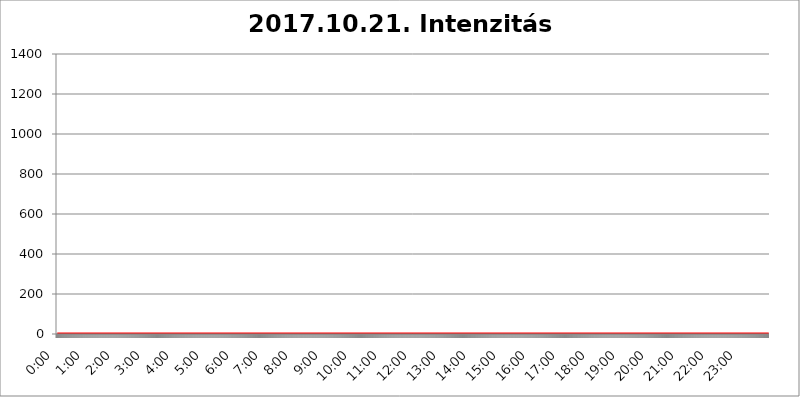
| Category | 2017.10.21. Intenzitás [W/m^2] |
|---|---|
| 0.0 | 0 |
| 0.0006944444444444445 | 0 |
| 0.001388888888888889 | 0 |
| 0.0020833333333333333 | 0 |
| 0.002777777777777778 | 0 |
| 0.003472222222222222 | 0 |
| 0.004166666666666667 | 0 |
| 0.004861111111111111 | 0 |
| 0.005555555555555556 | 0 |
| 0.0062499999999999995 | 0 |
| 0.006944444444444444 | 0 |
| 0.007638888888888889 | 0 |
| 0.008333333333333333 | 0 |
| 0.009027777777777779 | 0 |
| 0.009722222222222222 | 0 |
| 0.010416666666666666 | 0 |
| 0.011111111111111112 | 0 |
| 0.011805555555555555 | 0 |
| 0.012499999999999999 | 0 |
| 0.013194444444444444 | 0 |
| 0.013888888888888888 | 0 |
| 0.014583333333333332 | 0 |
| 0.015277777777777777 | 0 |
| 0.015972222222222224 | 0 |
| 0.016666666666666666 | 0 |
| 0.017361111111111112 | 0 |
| 0.018055555555555557 | 0 |
| 0.01875 | 0 |
| 0.019444444444444445 | 0 |
| 0.02013888888888889 | 0 |
| 0.020833333333333332 | 0 |
| 0.02152777777777778 | 0 |
| 0.022222222222222223 | 0 |
| 0.02291666666666667 | 0 |
| 0.02361111111111111 | 0 |
| 0.024305555555555556 | 0 |
| 0.024999999999999998 | 0 |
| 0.025694444444444447 | 0 |
| 0.02638888888888889 | 0 |
| 0.027083333333333334 | 0 |
| 0.027777777777777776 | 0 |
| 0.02847222222222222 | 0 |
| 0.029166666666666664 | 0 |
| 0.029861111111111113 | 0 |
| 0.030555555555555555 | 0 |
| 0.03125 | 0 |
| 0.03194444444444445 | 0 |
| 0.03263888888888889 | 0 |
| 0.03333333333333333 | 0 |
| 0.034027777777777775 | 0 |
| 0.034722222222222224 | 0 |
| 0.035416666666666666 | 0 |
| 0.036111111111111115 | 0 |
| 0.03680555555555556 | 0 |
| 0.0375 | 0 |
| 0.03819444444444444 | 0 |
| 0.03888888888888889 | 0 |
| 0.03958333333333333 | 0 |
| 0.04027777777777778 | 0 |
| 0.04097222222222222 | 0 |
| 0.041666666666666664 | 0 |
| 0.042361111111111106 | 0 |
| 0.04305555555555556 | 0 |
| 0.043750000000000004 | 0 |
| 0.044444444444444446 | 0 |
| 0.04513888888888889 | 0 |
| 0.04583333333333334 | 0 |
| 0.04652777777777778 | 0 |
| 0.04722222222222222 | 0 |
| 0.04791666666666666 | 0 |
| 0.04861111111111111 | 0 |
| 0.049305555555555554 | 0 |
| 0.049999999999999996 | 0 |
| 0.05069444444444445 | 0 |
| 0.051388888888888894 | 0 |
| 0.052083333333333336 | 0 |
| 0.05277777777777778 | 0 |
| 0.05347222222222222 | 0 |
| 0.05416666666666667 | 0 |
| 0.05486111111111111 | 0 |
| 0.05555555555555555 | 0 |
| 0.05625 | 0 |
| 0.05694444444444444 | 0 |
| 0.057638888888888885 | 0 |
| 0.05833333333333333 | 0 |
| 0.05902777777777778 | 0 |
| 0.059722222222222225 | 0 |
| 0.06041666666666667 | 0 |
| 0.061111111111111116 | 0 |
| 0.06180555555555556 | 0 |
| 0.0625 | 0 |
| 0.06319444444444444 | 0 |
| 0.06388888888888888 | 0 |
| 0.06458333333333334 | 0 |
| 0.06527777777777778 | 0 |
| 0.06597222222222222 | 0 |
| 0.06666666666666667 | 0 |
| 0.06736111111111111 | 0 |
| 0.06805555555555555 | 0 |
| 0.06874999999999999 | 0 |
| 0.06944444444444443 | 0 |
| 0.07013888888888889 | 0 |
| 0.07083333333333333 | 0 |
| 0.07152777777777779 | 0 |
| 0.07222222222222223 | 0 |
| 0.07291666666666667 | 0 |
| 0.07361111111111111 | 0 |
| 0.07430555555555556 | 0 |
| 0.075 | 0 |
| 0.07569444444444444 | 0 |
| 0.0763888888888889 | 0 |
| 0.07708333333333334 | 0 |
| 0.07777777777777778 | 0 |
| 0.07847222222222222 | 0 |
| 0.07916666666666666 | 0 |
| 0.0798611111111111 | 0 |
| 0.08055555555555556 | 0 |
| 0.08125 | 0 |
| 0.08194444444444444 | 0 |
| 0.08263888888888889 | 0 |
| 0.08333333333333333 | 0 |
| 0.08402777777777777 | 0 |
| 0.08472222222222221 | 0 |
| 0.08541666666666665 | 0 |
| 0.08611111111111112 | 0 |
| 0.08680555555555557 | 0 |
| 0.08750000000000001 | 0 |
| 0.08819444444444445 | 0 |
| 0.08888888888888889 | 0 |
| 0.08958333333333333 | 0 |
| 0.09027777777777778 | 0 |
| 0.09097222222222222 | 0 |
| 0.09166666666666667 | 0 |
| 0.09236111111111112 | 0 |
| 0.09305555555555556 | 0 |
| 0.09375 | 0 |
| 0.09444444444444444 | 0 |
| 0.09513888888888888 | 0 |
| 0.09583333333333333 | 0 |
| 0.09652777777777777 | 0 |
| 0.09722222222222222 | 0 |
| 0.09791666666666667 | 0 |
| 0.09861111111111111 | 0 |
| 0.09930555555555555 | 0 |
| 0.09999999999999999 | 0 |
| 0.10069444444444443 | 0 |
| 0.1013888888888889 | 0 |
| 0.10208333333333335 | 0 |
| 0.10277777777777779 | 0 |
| 0.10347222222222223 | 0 |
| 0.10416666666666667 | 0 |
| 0.10486111111111111 | 0 |
| 0.10555555555555556 | 0 |
| 0.10625 | 0 |
| 0.10694444444444444 | 0 |
| 0.1076388888888889 | 0 |
| 0.10833333333333334 | 0 |
| 0.10902777777777778 | 0 |
| 0.10972222222222222 | 0 |
| 0.1111111111111111 | 0 |
| 0.11180555555555556 | 0 |
| 0.11180555555555556 | 0 |
| 0.1125 | 0 |
| 0.11319444444444444 | 0 |
| 0.11388888888888889 | 0 |
| 0.11458333333333333 | 0 |
| 0.11527777777777777 | 0 |
| 0.11597222222222221 | 0 |
| 0.11666666666666665 | 0 |
| 0.1173611111111111 | 0 |
| 0.11805555555555557 | 0 |
| 0.11944444444444445 | 0 |
| 0.12013888888888889 | 0 |
| 0.12083333333333333 | 0 |
| 0.12152777777777778 | 0 |
| 0.12222222222222223 | 0 |
| 0.12291666666666667 | 0 |
| 0.12291666666666667 | 0 |
| 0.12361111111111112 | 0 |
| 0.12430555555555556 | 0 |
| 0.125 | 0 |
| 0.12569444444444444 | 0 |
| 0.12638888888888888 | 0 |
| 0.12708333333333333 | 0 |
| 0.16875 | 0 |
| 0.12847222222222224 | 0 |
| 0.12916666666666668 | 0 |
| 0.12986111111111112 | 0 |
| 0.13055555555555556 | 0 |
| 0.13125 | 0 |
| 0.13194444444444445 | 0 |
| 0.1326388888888889 | 0 |
| 0.13333333333333333 | 0 |
| 0.13402777777777777 | 0 |
| 0.13402777777777777 | 0 |
| 0.13472222222222222 | 0 |
| 0.13541666666666666 | 0 |
| 0.1361111111111111 | 0 |
| 0.13749999999999998 | 0 |
| 0.13819444444444443 | 0 |
| 0.1388888888888889 | 0 |
| 0.13958333333333334 | 0 |
| 0.14027777777777778 | 0 |
| 0.14097222222222222 | 0 |
| 0.14166666666666666 | 0 |
| 0.1423611111111111 | 0 |
| 0.14305555555555557 | 0 |
| 0.14375000000000002 | 0 |
| 0.14444444444444446 | 0 |
| 0.1451388888888889 | 0 |
| 0.1451388888888889 | 0 |
| 0.14652777777777778 | 0 |
| 0.14722222222222223 | 0 |
| 0.14791666666666667 | 0 |
| 0.1486111111111111 | 0 |
| 0.14930555555555555 | 0 |
| 0.15 | 0 |
| 0.15069444444444444 | 0 |
| 0.15138888888888888 | 0 |
| 0.15208333333333332 | 0 |
| 0.15277777777777776 | 0 |
| 0.15347222222222223 | 0 |
| 0.15416666666666667 | 0 |
| 0.15486111111111112 | 0 |
| 0.15555555555555556 | 0 |
| 0.15625 | 0 |
| 0.15694444444444444 | 0 |
| 0.15763888888888888 | 0 |
| 0.15833333333333333 | 0 |
| 0.15902777777777777 | 0 |
| 0.15972222222222224 | 0 |
| 0.16041666666666668 | 0 |
| 0.16111111111111112 | 0 |
| 0.16180555555555556 | 0 |
| 0.1625 | 0 |
| 0.16319444444444445 | 0 |
| 0.1638888888888889 | 0 |
| 0.16458333333333333 | 0 |
| 0.16527777777777777 | 0 |
| 0.16597222222222222 | 0 |
| 0.16666666666666666 | 0 |
| 0.1673611111111111 | 0 |
| 0.16805555555555554 | 0 |
| 0.16874999999999998 | 0 |
| 0.16944444444444443 | 0 |
| 0.17013888888888887 | 0 |
| 0.1708333333333333 | 0 |
| 0.17152777777777775 | 0 |
| 0.17222222222222225 | 0 |
| 0.1729166666666667 | 0 |
| 0.17361111111111113 | 0 |
| 0.17430555555555557 | 0 |
| 0.17500000000000002 | 0 |
| 0.17569444444444446 | 0 |
| 0.1763888888888889 | 0 |
| 0.17708333333333334 | 0 |
| 0.17777777777777778 | 0 |
| 0.17847222222222223 | 0 |
| 0.17916666666666667 | 0 |
| 0.1798611111111111 | 0 |
| 0.18055555555555555 | 0 |
| 0.18125 | 0 |
| 0.18194444444444444 | 0 |
| 0.1826388888888889 | 0 |
| 0.18333333333333335 | 0 |
| 0.1840277777777778 | 0 |
| 0.18472222222222223 | 0 |
| 0.18541666666666667 | 0 |
| 0.18611111111111112 | 0 |
| 0.18680555555555556 | 0 |
| 0.1875 | 0 |
| 0.18819444444444444 | 0 |
| 0.18888888888888888 | 0 |
| 0.18958333333333333 | 0 |
| 0.19027777777777777 | 0 |
| 0.1909722222222222 | 0 |
| 0.19166666666666665 | 0 |
| 0.19236111111111112 | 0 |
| 0.19305555555555554 | 0 |
| 0.19375 | 0 |
| 0.19444444444444445 | 0 |
| 0.1951388888888889 | 0 |
| 0.19583333333333333 | 0 |
| 0.19652777777777777 | 0 |
| 0.19722222222222222 | 0 |
| 0.19791666666666666 | 0 |
| 0.1986111111111111 | 0 |
| 0.19930555555555554 | 0 |
| 0.19999999999999998 | 0 |
| 0.20069444444444443 | 0 |
| 0.20138888888888887 | 0 |
| 0.2020833333333333 | 0 |
| 0.2027777777777778 | 0 |
| 0.2034722222222222 | 0 |
| 0.2041666666666667 | 0 |
| 0.20486111111111113 | 0 |
| 0.20555555555555557 | 0 |
| 0.20625000000000002 | 0 |
| 0.20694444444444446 | 0 |
| 0.2076388888888889 | 0 |
| 0.20833333333333334 | 0 |
| 0.20902777777777778 | 0 |
| 0.20972222222222223 | 0 |
| 0.21041666666666667 | 0 |
| 0.2111111111111111 | 0 |
| 0.21180555555555555 | 0 |
| 0.2125 | 0 |
| 0.21319444444444444 | 0 |
| 0.2138888888888889 | 0 |
| 0.21458333333333335 | 0 |
| 0.2152777777777778 | 0 |
| 0.21597222222222223 | 0 |
| 0.21666666666666667 | 0 |
| 0.21736111111111112 | 0 |
| 0.21805555555555556 | 0 |
| 0.21875 | 0 |
| 0.21944444444444444 | 0 |
| 0.22013888888888888 | 0 |
| 0.22083333333333333 | 0 |
| 0.22152777777777777 | 0 |
| 0.2222222222222222 | 0 |
| 0.22291666666666665 | 0 |
| 0.2236111111111111 | 0 |
| 0.22430555555555556 | 0 |
| 0.225 | 0 |
| 0.22569444444444445 | 0 |
| 0.2263888888888889 | 0 |
| 0.22708333333333333 | 0 |
| 0.22777777777777777 | 0 |
| 0.22847222222222222 | 0 |
| 0.22916666666666666 | 0 |
| 0.2298611111111111 | 0 |
| 0.23055555555555554 | 0 |
| 0.23124999999999998 | 0 |
| 0.23194444444444443 | 0 |
| 0.23263888888888887 | 0 |
| 0.2333333333333333 | 0 |
| 0.2340277777777778 | 0 |
| 0.2347222222222222 | 0 |
| 0.2354166666666667 | 0 |
| 0.23611111111111113 | 0 |
| 0.23680555555555557 | 0 |
| 0.23750000000000002 | 0 |
| 0.23819444444444446 | 0 |
| 0.2388888888888889 | 0 |
| 0.23958333333333334 | 0 |
| 0.24027777777777778 | 0 |
| 0.24097222222222223 | 0 |
| 0.24166666666666667 | 0 |
| 0.2423611111111111 | 0 |
| 0.24305555555555555 | 0 |
| 0.24375 | 0 |
| 0.24444444444444446 | 0 |
| 0.24513888888888888 | 0 |
| 0.24583333333333335 | 0 |
| 0.2465277777777778 | 0 |
| 0.24722222222222223 | 0 |
| 0.24791666666666667 | 0 |
| 0.24861111111111112 | 0 |
| 0.24930555555555556 | 0 |
| 0.25 | 0 |
| 0.25069444444444444 | 0 |
| 0.2513888888888889 | 0 |
| 0.2520833333333333 | 0 |
| 0.25277777777777777 | 0 |
| 0.2534722222222222 | 0 |
| 0.25416666666666665 | 0 |
| 0.2548611111111111 | 0 |
| 0.2555555555555556 | 0 |
| 0.25625000000000003 | 0 |
| 0.2569444444444445 | 0 |
| 0.2576388888888889 | 0 |
| 0.25833333333333336 | 0 |
| 0.2590277777777778 | 0 |
| 0.25972222222222224 | 0 |
| 0.2604166666666667 | 0 |
| 0.2611111111111111 | 0 |
| 0.26180555555555557 | 0 |
| 0.2625 | 0 |
| 0.26319444444444445 | 0 |
| 0.2638888888888889 | 0 |
| 0.26458333333333334 | 0 |
| 0.2652777777777778 | 0 |
| 0.2659722222222222 | 0 |
| 0.26666666666666666 | 0 |
| 0.2673611111111111 | 0 |
| 0.26805555555555555 | 0 |
| 0.26875 | 0 |
| 0.26944444444444443 | 0 |
| 0.2701388888888889 | 0 |
| 0.2708333333333333 | 0 |
| 0.27152777777777776 | 0 |
| 0.2722222222222222 | 0 |
| 0.27291666666666664 | 0 |
| 0.2736111111111111 | 0 |
| 0.2743055555555555 | 0 |
| 0.27499999999999997 | 0 |
| 0.27569444444444446 | 0 |
| 0.27638888888888885 | 0 |
| 0.27708333333333335 | 0 |
| 0.2777777777777778 | 0 |
| 0.27847222222222223 | 0 |
| 0.2791666666666667 | 0 |
| 0.2798611111111111 | 0 |
| 0.28055555555555556 | 0 |
| 0.28125 | 0 |
| 0.28194444444444444 | 0 |
| 0.2826388888888889 | 0 |
| 0.2833333333333333 | 0 |
| 0.28402777777777777 | 0 |
| 0.2847222222222222 | 0 |
| 0.28541666666666665 | 0 |
| 0.28611111111111115 | 0 |
| 0.28680555555555554 | 0 |
| 0.28750000000000003 | 0 |
| 0.2881944444444445 | 0 |
| 0.2888888888888889 | 0 |
| 0.28958333333333336 | 0 |
| 0.2902777777777778 | 0 |
| 0.29097222222222224 | 0 |
| 0.2916666666666667 | 0 |
| 0.2923611111111111 | 0 |
| 0.29305555555555557 | 0 |
| 0.29375 | 0 |
| 0.29444444444444445 | 0 |
| 0.2951388888888889 | 0 |
| 0.29583333333333334 | 0 |
| 0.2965277777777778 | 0 |
| 0.2972222222222222 | 0 |
| 0.29791666666666666 | 0 |
| 0.2986111111111111 | 0 |
| 0.29930555555555555 | 0 |
| 0.3 | 0 |
| 0.30069444444444443 | 0 |
| 0.3013888888888889 | 0 |
| 0.3020833333333333 | 0 |
| 0.30277777777777776 | 0 |
| 0.3034722222222222 | 0 |
| 0.30416666666666664 | 0 |
| 0.3048611111111111 | 0 |
| 0.3055555555555555 | 0 |
| 0.30624999999999997 | 0 |
| 0.3069444444444444 | 0 |
| 0.3076388888888889 | 0 |
| 0.30833333333333335 | 0 |
| 0.3090277777777778 | 0 |
| 0.30972222222222223 | 0 |
| 0.3104166666666667 | 0 |
| 0.3111111111111111 | 0 |
| 0.31180555555555556 | 0 |
| 0.3125 | 0 |
| 0.31319444444444444 | 0 |
| 0.3138888888888889 | 0 |
| 0.3145833333333333 | 0 |
| 0.31527777777777777 | 0 |
| 0.3159722222222222 | 0 |
| 0.31666666666666665 | 0 |
| 0.31736111111111115 | 0 |
| 0.31805555555555554 | 0 |
| 0.31875000000000003 | 0 |
| 0.3194444444444445 | 0 |
| 0.3201388888888889 | 0 |
| 0.32083333333333336 | 0 |
| 0.3215277777777778 | 0 |
| 0.32222222222222224 | 0 |
| 0.3229166666666667 | 0 |
| 0.3236111111111111 | 0 |
| 0.32430555555555557 | 0 |
| 0.325 | 0 |
| 0.32569444444444445 | 0 |
| 0.3263888888888889 | 0 |
| 0.32708333333333334 | 0 |
| 0.3277777777777778 | 0 |
| 0.3284722222222222 | 0 |
| 0.32916666666666666 | 0 |
| 0.3298611111111111 | 0 |
| 0.33055555555555555 | 0 |
| 0.33125 | 0 |
| 0.33194444444444443 | 0 |
| 0.3326388888888889 | 0 |
| 0.3333333333333333 | 0 |
| 0.3340277777777778 | 0 |
| 0.3347222222222222 | 0 |
| 0.3354166666666667 | 0 |
| 0.3361111111111111 | 0 |
| 0.3368055555555556 | 0 |
| 0.33749999999999997 | 0 |
| 0.33819444444444446 | 0 |
| 0.33888888888888885 | 0 |
| 0.33958333333333335 | 0 |
| 0.34027777777777773 | 0 |
| 0.34097222222222223 | 0 |
| 0.3416666666666666 | 0 |
| 0.3423611111111111 | 0 |
| 0.3430555555555555 | 0 |
| 0.34375 | 0 |
| 0.3444444444444445 | 0 |
| 0.3451388888888889 | 0 |
| 0.3458333333333334 | 0 |
| 0.34652777777777777 | 0 |
| 0.34722222222222227 | 0 |
| 0.34791666666666665 | 0 |
| 0.34861111111111115 | 0 |
| 0.34930555555555554 | 0 |
| 0.35000000000000003 | 0 |
| 0.3506944444444444 | 0 |
| 0.3513888888888889 | 0 |
| 0.3520833333333333 | 0 |
| 0.3527777777777778 | 0 |
| 0.3534722222222222 | 0 |
| 0.3541666666666667 | 0 |
| 0.3548611111111111 | 0 |
| 0.35555555555555557 | 0 |
| 0.35625 | 0 |
| 0.35694444444444445 | 0 |
| 0.3576388888888889 | 0 |
| 0.35833333333333334 | 0 |
| 0.3590277777777778 | 0 |
| 0.3597222222222222 | 0 |
| 0.36041666666666666 | 0 |
| 0.3611111111111111 | 0 |
| 0.36180555555555555 | 0 |
| 0.3625 | 0 |
| 0.36319444444444443 | 0 |
| 0.3638888888888889 | 0 |
| 0.3645833333333333 | 0 |
| 0.3652777777777778 | 0 |
| 0.3659722222222222 | 0 |
| 0.3666666666666667 | 0 |
| 0.3673611111111111 | 0 |
| 0.3680555555555556 | 0 |
| 0.36874999999999997 | 0 |
| 0.36944444444444446 | 0 |
| 0.37013888888888885 | 0 |
| 0.37083333333333335 | 0 |
| 0.37152777777777773 | 0 |
| 0.37222222222222223 | 0 |
| 0.3729166666666666 | 0 |
| 0.3736111111111111 | 0 |
| 0.3743055555555555 | 0 |
| 0.375 | 0 |
| 0.3756944444444445 | 0 |
| 0.3763888888888889 | 0 |
| 0.3770833333333334 | 0 |
| 0.37777777777777777 | 0 |
| 0.37847222222222227 | 0 |
| 0.37916666666666665 | 0 |
| 0.37986111111111115 | 0 |
| 0.38055555555555554 | 0 |
| 0.38125000000000003 | 0 |
| 0.3819444444444444 | 0 |
| 0.3826388888888889 | 0 |
| 0.3833333333333333 | 0 |
| 0.3840277777777778 | 0 |
| 0.3847222222222222 | 0 |
| 0.3854166666666667 | 0 |
| 0.3861111111111111 | 0 |
| 0.38680555555555557 | 0 |
| 0.3875 | 0 |
| 0.38819444444444445 | 0 |
| 0.3888888888888889 | 0 |
| 0.38958333333333334 | 0 |
| 0.3902777777777778 | 0 |
| 0.3909722222222222 | 0 |
| 0.39166666666666666 | 0 |
| 0.3923611111111111 | 0 |
| 0.39305555555555555 | 0 |
| 0.39375 | 0 |
| 0.39444444444444443 | 0 |
| 0.3951388888888889 | 0 |
| 0.3958333333333333 | 0 |
| 0.3965277777777778 | 0 |
| 0.3972222222222222 | 0 |
| 0.3979166666666667 | 0 |
| 0.3986111111111111 | 0 |
| 0.3993055555555556 | 0 |
| 0.39999999999999997 | 0 |
| 0.40069444444444446 | 0 |
| 0.40138888888888885 | 0 |
| 0.40208333333333335 | 0 |
| 0.40277777777777773 | 0 |
| 0.40347222222222223 | 0 |
| 0.4041666666666666 | 0 |
| 0.4048611111111111 | 0 |
| 0.4055555555555555 | 0 |
| 0.40625 | 0 |
| 0.4069444444444445 | 0 |
| 0.4076388888888889 | 0 |
| 0.4083333333333334 | 0 |
| 0.40902777777777777 | 0 |
| 0.40972222222222227 | 0 |
| 0.41041666666666665 | 0 |
| 0.41111111111111115 | 0 |
| 0.41180555555555554 | 0 |
| 0.41250000000000003 | 0 |
| 0.4131944444444444 | 0 |
| 0.4138888888888889 | 0 |
| 0.4145833333333333 | 0 |
| 0.4152777777777778 | 0 |
| 0.4159722222222222 | 0 |
| 0.4166666666666667 | 0 |
| 0.4173611111111111 | 0 |
| 0.41805555555555557 | 0 |
| 0.41875 | 0 |
| 0.41944444444444445 | 0 |
| 0.4201388888888889 | 0 |
| 0.42083333333333334 | 0 |
| 0.4215277777777778 | 0 |
| 0.4222222222222222 | 0 |
| 0.42291666666666666 | 0 |
| 0.4236111111111111 | 0 |
| 0.42430555555555555 | 0 |
| 0.425 | 0 |
| 0.42569444444444443 | 0 |
| 0.4263888888888889 | 0 |
| 0.4270833333333333 | 0 |
| 0.4277777777777778 | 0 |
| 0.4284722222222222 | 0 |
| 0.4291666666666667 | 0 |
| 0.4298611111111111 | 0 |
| 0.4305555555555556 | 0 |
| 0.43124999999999997 | 0 |
| 0.43194444444444446 | 0 |
| 0.43263888888888885 | 0 |
| 0.43333333333333335 | 0 |
| 0.43402777777777773 | 0 |
| 0.43472222222222223 | 0 |
| 0.4354166666666666 | 0 |
| 0.4361111111111111 | 0 |
| 0.4368055555555555 | 0 |
| 0.4375 | 0 |
| 0.4381944444444445 | 0 |
| 0.4388888888888889 | 0 |
| 0.4395833333333334 | 0 |
| 0.44027777777777777 | 0 |
| 0.44097222222222227 | 0 |
| 0.44166666666666665 | 0 |
| 0.44236111111111115 | 0 |
| 0.44305555555555554 | 0 |
| 0.44375000000000003 | 0 |
| 0.4444444444444444 | 0 |
| 0.4451388888888889 | 0 |
| 0.4458333333333333 | 0 |
| 0.4465277777777778 | 0 |
| 0.4472222222222222 | 0 |
| 0.4479166666666667 | 0 |
| 0.4486111111111111 | 0 |
| 0.44930555555555557 | 0 |
| 0.45 | 0 |
| 0.45069444444444445 | 0 |
| 0.4513888888888889 | 0 |
| 0.45208333333333334 | 0 |
| 0.4527777777777778 | 0 |
| 0.4534722222222222 | 0 |
| 0.45416666666666666 | 0 |
| 0.4548611111111111 | 0 |
| 0.45555555555555555 | 0 |
| 0.45625 | 0 |
| 0.45694444444444443 | 0 |
| 0.4576388888888889 | 0 |
| 0.4583333333333333 | 0 |
| 0.4590277777777778 | 0 |
| 0.4597222222222222 | 0 |
| 0.4604166666666667 | 0 |
| 0.4611111111111111 | 0 |
| 0.4618055555555556 | 0 |
| 0.46249999999999997 | 0 |
| 0.46319444444444446 | 0 |
| 0.46388888888888885 | 0 |
| 0.46458333333333335 | 0 |
| 0.46527777777777773 | 0 |
| 0.46597222222222223 | 0 |
| 0.4666666666666666 | 0 |
| 0.4673611111111111 | 0 |
| 0.4680555555555555 | 0 |
| 0.46875 | 0 |
| 0.4694444444444445 | 0 |
| 0.4701388888888889 | 0 |
| 0.4708333333333334 | 0 |
| 0.47152777777777777 | 0 |
| 0.47222222222222227 | 0 |
| 0.47291666666666665 | 0 |
| 0.47361111111111115 | 0 |
| 0.47430555555555554 | 0 |
| 0.47500000000000003 | 0 |
| 0.4756944444444444 | 0 |
| 0.4763888888888889 | 0 |
| 0.4770833333333333 | 0 |
| 0.4777777777777778 | 0 |
| 0.4784722222222222 | 0 |
| 0.4791666666666667 | 0 |
| 0.4798611111111111 | 0 |
| 0.48055555555555557 | 0 |
| 0.48125 | 0 |
| 0.48194444444444445 | 0 |
| 0.4826388888888889 | 0 |
| 0.48333333333333334 | 0 |
| 0.4840277777777778 | 0 |
| 0.4847222222222222 | 0 |
| 0.48541666666666666 | 0 |
| 0.4861111111111111 | 0 |
| 0.48680555555555555 | 0 |
| 0.4875 | 0 |
| 0.48819444444444443 | 0 |
| 0.4888888888888889 | 0 |
| 0.4895833333333333 | 0 |
| 0.4902777777777778 | 0 |
| 0.4909722222222222 | 0 |
| 0.4916666666666667 | 0 |
| 0.4923611111111111 | 0 |
| 0.4930555555555556 | 0 |
| 0.49374999999999997 | 0 |
| 0.49444444444444446 | 0 |
| 0.49513888888888885 | 0 |
| 0.49583333333333335 | 0 |
| 0.49652777777777773 | 0 |
| 0.49722222222222223 | 0 |
| 0.4979166666666666 | 0 |
| 0.4986111111111111 | 0 |
| 0.4993055555555555 | 0 |
| 0.5 | 0 |
| 0.5006944444444444 | 0 |
| 0.5013888888888889 | 0 |
| 0.5020833333333333 | 0 |
| 0.5027777777777778 | 0 |
| 0.5034722222222222 | 0 |
| 0.5041666666666667 | 0 |
| 0.5048611111111111 | 0 |
| 0.5055555555555555 | 0 |
| 0.50625 | 0 |
| 0.5069444444444444 | 0 |
| 0.5076388888888889 | 0 |
| 0.5083333333333333 | 0 |
| 0.5090277777777777 | 0 |
| 0.5097222222222222 | 0 |
| 0.5104166666666666 | 0 |
| 0.5111111111111112 | 0 |
| 0.5118055555555555 | 0 |
| 0.5125000000000001 | 0 |
| 0.5131944444444444 | 0 |
| 0.513888888888889 | 0 |
| 0.5145833333333333 | 0 |
| 0.5152777777777778 | 0 |
| 0.5159722222222222 | 0 |
| 0.5166666666666667 | 0 |
| 0.517361111111111 | 0 |
| 0.5180555555555556 | 0 |
| 0.5187499999999999 | 0 |
| 0.5194444444444445 | 0 |
| 0.5201388888888888 | 0 |
| 0.5208333333333334 | 0 |
| 0.5215277777777778 | 0 |
| 0.5222222222222223 | 0 |
| 0.5229166666666667 | 0 |
| 0.5236111111111111 | 0 |
| 0.5243055555555556 | 0 |
| 0.525 | 0 |
| 0.5256944444444445 | 0 |
| 0.5263888888888889 | 0 |
| 0.5270833333333333 | 0 |
| 0.5277777777777778 | 0 |
| 0.5284722222222222 | 0 |
| 0.5291666666666667 | 0 |
| 0.5298611111111111 | 0 |
| 0.5305555555555556 | 0 |
| 0.53125 | 0 |
| 0.5319444444444444 | 0 |
| 0.5326388888888889 | 0 |
| 0.5333333333333333 | 0 |
| 0.5340277777777778 | 0 |
| 0.5347222222222222 | 0 |
| 0.5354166666666667 | 0 |
| 0.5361111111111111 | 0 |
| 0.5368055555555555 | 0 |
| 0.5375 | 0 |
| 0.5381944444444444 | 0 |
| 0.5388888888888889 | 0 |
| 0.5395833333333333 | 0 |
| 0.5402777777777777 | 0 |
| 0.5409722222222222 | 0 |
| 0.5416666666666666 | 0 |
| 0.5423611111111112 | 0 |
| 0.5430555555555555 | 0 |
| 0.5437500000000001 | 0 |
| 0.5444444444444444 | 0 |
| 0.545138888888889 | 0 |
| 0.5458333333333333 | 0 |
| 0.5465277777777778 | 0 |
| 0.5472222222222222 | 0 |
| 0.5479166666666667 | 0 |
| 0.548611111111111 | 0 |
| 0.5493055555555556 | 0 |
| 0.5499999999999999 | 0 |
| 0.5506944444444445 | 0 |
| 0.5513888888888888 | 0 |
| 0.5520833333333334 | 0 |
| 0.5527777777777778 | 0 |
| 0.5534722222222223 | 0 |
| 0.5541666666666667 | 0 |
| 0.5548611111111111 | 0 |
| 0.5555555555555556 | 0 |
| 0.55625 | 0 |
| 0.5569444444444445 | 0 |
| 0.5576388888888889 | 0 |
| 0.5583333333333333 | 0 |
| 0.5590277777777778 | 0 |
| 0.5597222222222222 | 0 |
| 0.5604166666666667 | 0 |
| 0.5611111111111111 | 0 |
| 0.5618055555555556 | 0 |
| 0.5625 | 0 |
| 0.5631944444444444 | 0 |
| 0.5638888888888889 | 0 |
| 0.5645833333333333 | 0 |
| 0.5652777777777778 | 0 |
| 0.5659722222222222 | 0 |
| 0.5666666666666667 | 0 |
| 0.5673611111111111 | 0 |
| 0.5680555555555555 | 0 |
| 0.56875 | 0 |
| 0.5694444444444444 | 0 |
| 0.5701388888888889 | 0 |
| 0.5708333333333333 | 0 |
| 0.5715277777777777 | 0 |
| 0.5722222222222222 | 0 |
| 0.5729166666666666 | 0 |
| 0.5736111111111112 | 0 |
| 0.5743055555555555 | 0 |
| 0.5750000000000001 | 0 |
| 0.5756944444444444 | 0 |
| 0.576388888888889 | 0 |
| 0.5770833333333333 | 0 |
| 0.5777777777777778 | 0 |
| 0.5784722222222222 | 0 |
| 0.5791666666666667 | 0 |
| 0.579861111111111 | 0 |
| 0.5805555555555556 | 0 |
| 0.5812499999999999 | 0 |
| 0.5819444444444445 | 0 |
| 0.5826388888888888 | 0 |
| 0.5833333333333334 | 0 |
| 0.5840277777777778 | 0 |
| 0.5847222222222223 | 0 |
| 0.5854166666666667 | 0 |
| 0.5861111111111111 | 0 |
| 0.5868055555555556 | 0 |
| 0.5875 | 0 |
| 0.5881944444444445 | 0 |
| 0.5888888888888889 | 0 |
| 0.5895833333333333 | 0 |
| 0.5902777777777778 | 0 |
| 0.5909722222222222 | 0 |
| 0.5916666666666667 | 0 |
| 0.5923611111111111 | 0 |
| 0.5930555555555556 | 0 |
| 0.59375 | 0 |
| 0.5944444444444444 | 0 |
| 0.5951388888888889 | 0 |
| 0.5958333333333333 | 0 |
| 0.5965277777777778 | 0 |
| 0.5972222222222222 | 0 |
| 0.5979166666666667 | 0 |
| 0.5986111111111111 | 0 |
| 0.5993055555555555 | 0 |
| 0.6 | 0 |
| 0.6006944444444444 | 0 |
| 0.6013888888888889 | 0 |
| 0.6020833333333333 | 0 |
| 0.6027777777777777 | 0 |
| 0.6034722222222222 | 0 |
| 0.6041666666666666 | 0 |
| 0.6048611111111112 | 0 |
| 0.6055555555555555 | 0 |
| 0.6062500000000001 | 0 |
| 0.6069444444444444 | 0 |
| 0.607638888888889 | 0 |
| 0.6083333333333333 | 0 |
| 0.6090277777777778 | 0 |
| 0.6097222222222222 | 0 |
| 0.6104166666666667 | 0 |
| 0.611111111111111 | 0 |
| 0.6118055555555556 | 0 |
| 0.6124999999999999 | 0 |
| 0.6131944444444445 | 0 |
| 0.6138888888888888 | 0 |
| 0.6145833333333334 | 0 |
| 0.6152777777777778 | 0 |
| 0.6159722222222223 | 0 |
| 0.6166666666666667 | 0 |
| 0.6173611111111111 | 0 |
| 0.6180555555555556 | 0 |
| 0.61875 | 0 |
| 0.6194444444444445 | 0 |
| 0.6201388888888889 | 0 |
| 0.6208333333333333 | 0 |
| 0.6215277777777778 | 0 |
| 0.6222222222222222 | 0 |
| 0.6229166666666667 | 0 |
| 0.6236111111111111 | 0 |
| 0.6243055555555556 | 0 |
| 0.625 | 0 |
| 0.6256944444444444 | 0 |
| 0.6263888888888889 | 0 |
| 0.6270833333333333 | 0 |
| 0.6277777777777778 | 0 |
| 0.6284722222222222 | 0 |
| 0.6291666666666667 | 0 |
| 0.6298611111111111 | 0 |
| 0.6305555555555555 | 0 |
| 0.63125 | 0 |
| 0.6319444444444444 | 0 |
| 0.6326388888888889 | 0 |
| 0.6333333333333333 | 0 |
| 0.6340277777777777 | 0 |
| 0.6347222222222222 | 0 |
| 0.6354166666666666 | 0 |
| 0.6361111111111112 | 0 |
| 0.6368055555555555 | 0 |
| 0.6375000000000001 | 0 |
| 0.6381944444444444 | 0 |
| 0.638888888888889 | 0 |
| 0.6395833333333333 | 0 |
| 0.6402777777777778 | 0 |
| 0.6409722222222222 | 0 |
| 0.6416666666666667 | 0 |
| 0.642361111111111 | 0 |
| 0.6430555555555556 | 0 |
| 0.6437499999999999 | 0 |
| 0.6444444444444445 | 0 |
| 0.6451388888888888 | 0 |
| 0.6458333333333334 | 0 |
| 0.6465277777777778 | 0 |
| 0.6472222222222223 | 0 |
| 0.6479166666666667 | 0 |
| 0.6486111111111111 | 0 |
| 0.6493055555555556 | 0 |
| 0.65 | 0 |
| 0.6506944444444445 | 0 |
| 0.6513888888888889 | 0 |
| 0.6520833333333333 | 0 |
| 0.6527777777777778 | 0 |
| 0.6534722222222222 | 0 |
| 0.6541666666666667 | 0 |
| 0.6548611111111111 | 0 |
| 0.6555555555555556 | 0 |
| 0.65625 | 0 |
| 0.6569444444444444 | 0 |
| 0.6576388888888889 | 0 |
| 0.6583333333333333 | 0 |
| 0.6590277777777778 | 0 |
| 0.6597222222222222 | 0 |
| 0.6604166666666667 | 0 |
| 0.6611111111111111 | 0 |
| 0.6618055555555555 | 0 |
| 0.6625 | 0 |
| 0.6631944444444444 | 0 |
| 0.6638888888888889 | 0 |
| 0.6645833333333333 | 0 |
| 0.6652777777777777 | 0 |
| 0.6659722222222222 | 0 |
| 0.6666666666666666 | 0 |
| 0.6673611111111111 | 0 |
| 0.6680555555555556 | 0 |
| 0.6687500000000001 | 0 |
| 0.6694444444444444 | 0 |
| 0.6701388888888888 | 0 |
| 0.6708333333333334 | 0 |
| 0.6715277777777778 | 0 |
| 0.6722222222222222 | 0 |
| 0.6729166666666666 | 0 |
| 0.6736111111111112 | 0 |
| 0.6743055555555556 | 0 |
| 0.6749999999999999 | 0 |
| 0.6756944444444444 | 0 |
| 0.6763888888888889 | 0 |
| 0.6770833333333334 | 0 |
| 0.6777777777777777 | 0 |
| 0.6784722222222223 | 0 |
| 0.6791666666666667 | 0 |
| 0.6798611111111111 | 0 |
| 0.6805555555555555 | 0 |
| 0.68125 | 0 |
| 0.6819444444444445 | 0 |
| 0.6826388888888889 | 0 |
| 0.6833333333333332 | 0 |
| 0.6840277777777778 | 0 |
| 0.6847222222222222 | 0 |
| 0.6854166666666667 | 0 |
| 0.686111111111111 | 0 |
| 0.6868055555555556 | 0 |
| 0.6875 | 0 |
| 0.6881944444444444 | 0 |
| 0.688888888888889 | 0 |
| 0.6895833333333333 | 0 |
| 0.6902777777777778 | 0 |
| 0.6909722222222222 | 0 |
| 0.6916666666666668 | 0 |
| 0.6923611111111111 | 0 |
| 0.6930555555555555 | 0 |
| 0.69375 | 0 |
| 0.6944444444444445 | 0 |
| 0.6951388888888889 | 0 |
| 0.6958333333333333 | 0 |
| 0.6965277777777777 | 0 |
| 0.6972222222222223 | 0 |
| 0.6979166666666666 | 0 |
| 0.6986111111111111 | 0 |
| 0.6993055555555556 | 0 |
| 0.7000000000000001 | 0 |
| 0.7006944444444444 | 0 |
| 0.7013888888888888 | 0 |
| 0.7020833333333334 | 0 |
| 0.7027777777777778 | 0 |
| 0.7034722222222222 | 0 |
| 0.7041666666666666 | 0 |
| 0.7048611111111112 | 0 |
| 0.7055555555555556 | 0 |
| 0.7062499999999999 | 0 |
| 0.7069444444444444 | 0 |
| 0.7076388888888889 | 0 |
| 0.7083333333333334 | 0 |
| 0.7090277777777777 | 0 |
| 0.7097222222222223 | 0 |
| 0.7104166666666667 | 0 |
| 0.7111111111111111 | 0 |
| 0.7118055555555555 | 0 |
| 0.7125 | 0 |
| 0.7131944444444445 | 0 |
| 0.7138888888888889 | 0 |
| 0.7145833333333332 | 0 |
| 0.7152777777777778 | 0 |
| 0.7159722222222222 | 0 |
| 0.7166666666666667 | 0 |
| 0.717361111111111 | 0 |
| 0.7180555555555556 | 0 |
| 0.71875 | 0 |
| 0.7194444444444444 | 0 |
| 0.720138888888889 | 0 |
| 0.7208333333333333 | 0 |
| 0.7215277777777778 | 0 |
| 0.7222222222222222 | 0 |
| 0.7229166666666668 | 0 |
| 0.7236111111111111 | 0 |
| 0.7243055555555555 | 0 |
| 0.725 | 0 |
| 0.7256944444444445 | 0 |
| 0.7263888888888889 | 0 |
| 0.7270833333333333 | 0 |
| 0.7277777777777777 | 0 |
| 0.7284722222222223 | 0 |
| 0.7291666666666666 | 0 |
| 0.7298611111111111 | 0 |
| 0.7305555555555556 | 0 |
| 0.7312500000000001 | 0 |
| 0.7319444444444444 | 0 |
| 0.7326388888888888 | 0 |
| 0.7333333333333334 | 0 |
| 0.7340277777777778 | 0 |
| 0.7347222222222222 | 0 |
| 0.7354166666666666 | 0 |
| 0.7361111111111112 | 0 |
| 0.7368055555555556 | 0 |
| 0.7374999999999999 | 0 |
| 0.7381944444444444 | 0 |
| 0.7388888888888889 | 0 |
| 0.7395833333333334 | 0 |
| 0.7402777777777777 | 0 |
| 0.7409722222222223 | 0 |
| 0.7416666666666667 | 0 |
| 0.7423611111111111 | 0 |
| 0.7430555555555555 | 0 |
| 0.74375 | 0 |
| 0.7444444444444445 | 0 |
| 0.7451388888888889 | 0 |
| 0.7458333333333332 | 0 |
| 0.7465277777777778 | 0 |
| 0.7472222222222222 | 0 |
| 0.7479166666666667 | 0 |
| 0.748611111111111 | 0 |
| 0.7493055555555556 | 0 |
| 0.75 | 0 |
| 0.7506944444444444 | 0 |
| 0.751388888888889 | 0 |
| 0.7520833333333333 | 0 |
| 0.7527777777777778 | 0 |
| 0.7534722222222222 | 0 |
| 0.7541666666666668 | 0 |
| 0.7548611111111111 | 0 |
| 0.7555555555555555 | 0 |
| 0.75625 | 0 |
| 0.7569444444444445 | 0 |
| 0.7576388888888889 | 0 |
| 0.7583333333333333 | 0 |
| 0.7590277777777777 | 0 |
| 0.7597222222222223 | 0 |
| 0.7604166666666666 | 0 |
| 0.7611111111111111 | 0 |
| 0.7618055555555556 | 0 |
| 0.7625000000000001 | 0 |
| 0.7631944444444444 | 0 |
| 0.7638888888888888 | 0 |
| 0.7645833333333334 | 0 |
| 0.7652777777777778 | 0 |
| 0.7659722222222222 | 0 |
| 0.7666666666666666 | 0 |
| 0.7673611111111112 | 0 |
| 0.7680555555555556 | 0 |
| 0.7687499999999999 | 0 |
| 0.7694444444444444 | 0 |
| 0.7701388888888889 | 0 |
| 0.7708333333333334 | 0 |
| 0.7715277777777777 | 0 |
| 0.7722222222222223 | 0 |
| 0.7729166666666667 | 0 |
| 0.7736111111111111 | 0 |
| 0.7743055555555555 | 0 |
| 0.775 | 0 |
| 0.7756944444444445 | 0 |
| 0.7763888888888889 | 0 |
| 0.7770833333333332 | 0 |
| 0.7777777777777778 | 0 |
| 0.7784722222222222 | 0 |
| 0.7791666666666667 | 0 |
| 0.779861111111111 | 0 |
| 0.7805555555555556 | 0 |
| 0.78125 | 0 |
| 0.7819444444444444 | 0 |
| 0.782638888888889 | 0 |
| 0.7833333333333333 | 0 |
| 0.7840277777777778 | 0 |
| 0.7847222222222222 | 0 |
| 0.7854166666666668 | 0 |
| 0.7861111111111111 | 0 |
| 0.7868055555555555 | 0 |
| 0.7875 | 0 |
| 0.7881944444444445 | 0 |
| 0.7888888888888889 | 0 |
| 0.7895833333333333 | 0 |
| 0.7902777777777777 | 0 |
| 0.7909722222222223 | 0 |
| 0.7916666666666666 | 0 |
| 0.7923611111111111 | 0 |
| 0.7930555555555556 | 0 |
| 0.7937500000000001 | 0 |
| 0.7944444444444444 | 0 |
| 0.7951388888888888 | 0 |
| 0.7958333333333334 | 0 |
| 0.7965277777777778 | 0 |
| 0.7972222222222222 | 0 |
| 0.7979166666666666 | 0 |
| 0.7986111111111112 | 0 |
| 0.7993055555555556 | 0 |
| 0.7999999999999999 | 0 |
| 0.8006944444444444 | 0 |
| 0.8013888888888889 | 0 |
| 0.8020833333333334 | 0 |
| 0.8027777777777777 | 0 |
| 0.8034722222222223 | 0 |
| 0.8041666666666667 | 0 |
| 0.8048611111111111 | 0 |
| 0.8055555555555555 | 0 |
| 0.80625 | 0 |
| 0.8069444444444445 | 0 |
| 0.8076388888888889 | 0 |
| 0.8083333333333332 | 0 |
| 0.8090277777777778 | 0 |
| 0.8097222222222222 | 0 |
| 0.8104166666666667 | 0 |
| 0.811111111111111 | 0 |
| 0.8118055555555556 | 0 |
| 0.8125 | 0 |
| 0.8131944444444444 | 0 |
| 0.813888888888889 | 0 |
| 0.8145833333333333 | 0 |
| 0.8152777777777778 | 0 |
| 0.8159722222222222 | 0 |
| 0.8166666666666668 | 0 |
| 0.8173611111111111 | 0 |
| 0.8180555555555555 | 0 |
| 0.81875 | 0 |
| 0.8194444444444445 | 0 |
| 0.8201388888888889 | 0 |
| 0.8208333333333333 | 0 |
| 0.8215277777777777 | 0 |
| 0.8222222222222223 | 0 |
| 0.8229166666666666 | 0 |
| 0.8236111111111111 | 0 |
| 0.8243055555555556 | 0 |
| 0.8250000000000001 | 0 |
| 0.8256944444444444 | 0 |
| 0.8263888888888888 | 0 |
| 0.8270833333333334 | 0 |
| 0.8277777777777778 | 0 |
| 0.8284722222222222 | 0 |
| 0.8291666666666666 | 0 |
| 0.8298611111111112 | 0 |
| 0.8305555555555556 | 0 |
| 0.8312499999999999 | 0 |
| 0.8319444444444444 | 0 |
| 0.8326388888888889 | 0 |
| 0.8333333333333334 | 0 |
| 0.8340277777777777 | 0 |
| 0.8347222222222223 | 0 |
| 0.8354166666666667 | 0 |
| 0.8361111111111111 | 0 |
| 0.8368055555555555 | 0 |
| 0.8375 | 0 |
| 0.8381944444444445 | 0 |
| 0.8388888888888889 | 0 |
| 0.8395833333333332 | 0 |
| 0.8402777777777778 | 0 |
| 0.8409722222222222 | 0 |
| 0.8416666666666667 | 0 |
| 0.842361111111111 | 0 |
| 0.8430555555555556 | 0 |
| 0.84375 | 0 |
| 0.8444444444444444 | 0 |
| 0.845138888888889 | 0 |
| 0.8458333333333333 | 0 |
| 0.8465277777777778 | 0 |
| 0.8472222222222222 | 0 |
| 0.8479166666666668 | 0 |
| 0.8486111111111111 | 0 |
| 0.8493055555555555 | 0 |
| 0.85 | 0 |
| 0.8506944444444445 | 0 |
| 0.8513888888888889 | 0 |
| 0.8520833333333333 | 0 |
| 0.8527777777777777 | 0 |
| 0.8534722222222223 | 0 |
| 0.8541666666666666 | 0 |
| 0.8548611111111111 | 0 |
| 0.8555555555555556 | 0 |
| 0.8562500000000001 | 0 |
| 0.8569444444444444 | 0 |
| 0.8576388888888888 | 0 |
| 0.8583333333333334 | 0 |
| 0.8590277777777778 | 0 |
| 0.8597222222222222 | 0 |
| 0.8604166666666666 | 0 |
| 0.8611111111111112 | 0 |
| 0.8618055555555556 | 0 |
| 0.8624999999999999 | 0 |
| 0.8631944444444444 | 0 |
| 0.8638888888888889 | 0 |
| 0.8645833333333334 | 0 |
| 0.8652777777777777 | 0 |
| 0.8659722222222223 | 0 |
| 0.8666666666666667 | 0 |
| 0.8673611111111111 | 0 |
| 0.8680555555555555 | 0 |
| 0.86875 | 0 |
| 0.8694444444444445 | 0 |
| 0.8701388888888889 | 0 |
| 0.8708333333333332 | 0 |
| 0.8715277777777778 | 0 |
| 0.8722222222222222 | 0 |
| 0.8729166666666667 | 0 |
| 0.873611111111111 | 0 |
| 0.8743055555555556 | 0 |
| 0.875 | 0 |
| 0.8756944444444444 | 0 |
| 0.876388888888889 | 0 |
| 0.8770833333333333 | 0 |
| 0.8777777777777778 | 0 |
| 0.8784722222222222 | 0 |
| 0.8791666666666668 | 0 |
| 0.8798611111111111 | 0 |
| 0.8805555555555555 | 0 |
| 0.88125 | 0 |
| 0.8819444444444445 | 0 |
| 0.8826388888888889 | 0 |
| 0.8833333333333333 | 0 |
| 0.8840277777777777 | 0 |
| 0.8847222222222223 | 0 |
| 0.8854166666666666 | 0 |
| 0.8861111111111111 | 0 |
| 0.8868055555555556 | 0 |
| 0.8875000000000001 | 0 |
| 0.8881944444444444 | 0 |
| 0.8888888888888888 | 0 |
| 0.8895833333333334 | 0 |
| 0.8902777777777778 | 0 |
| 0.8909722222222222 | 0 |
| 0.8916666666666666 | 0 |
| 0.8923611111111112 | 0 |
| 0.8930555555555556 | 0 |
| 0.8937499999999999 | 0 |
| 0.8944444444444444 | 0 |
| 0.8951388888888889 | 0 |
| 0.8958333333333334 | 0 |
| 0.8965277777777777 | 0 |
| 0.8972222222222223 | 0 |
| 0.8979166666666667 | 0 |
| 0.8986111111111111 | 0 |
| 0.8993055555555555 | 0 |
| 0.9 | 0 |
| 0.9006944444444445 | 0 |
| 0.9013888888888889 | 0 |
| 0.9020833333333332 | 0 |
| 0.9027777777777778 | 0 |
| 0.9034722222222222 | 0 |
| 0.9041666666666667 | 0 |
| 0.904861111111111 | 0 |
| 0.9055555555555556 | 0 |
| 0.90625 | 0 |
| 0.9069444444444444 | 0 |
| 0.907638888888889 | 0 |
| 0.9083333333333333 | 0 |
| 0.9090277777777778 | 0 |
| 0.9097222222222222 | 0 |
| 0.9104166666666668 | 0 |
| 0.9111111111111111 | 0 |
| 0.9118055555555555 | 0 |
| 0.9125 | 0 |
| 0.9131944444444445 | 0 |
| 0.9138888888888889 | 0 |
| 0.9145833333333333 | 0 |
| 0.9152777777777777 | 0 |
| 0.9159722222222223 | 0 |
| 0.9166666666666666 | 0 |
| 0.9173611111111111 | 0 |
| 0.9180555555555556 | 0 |
| 0.9187500000000001 | 0 |
| 0.9194444444444444 | 0 |
| 0.9201388888888888 | 0 |
| 0.9208333333333334 | 0 |
| 0.9215277777777778 | 0 |
| 0.9222222222222222 | 0 |
| 0.9229166666666666 | 0 |
| 0.9236111111111112 | 0 |
| 0.9243055555555556 | 0 |
| 0.9249999999999999 | 0 |
| 0.9256944444444444 | 0 |
| 0.9263888888888889 | 0 |
| 0.9270833333333334 | 0 |
| 0.9277777777777777 | 0 |
| 0.9284722222222223 | 0 |
| 0.9291666666666667 | 0 |
| 0.9298611111111111 | 0 |
| 0.9305555555555555 | 0 |
| 0.93125 | 0 |
| 0.9319444444444445 | 0 |
| 0.9326388888888889 | 0 |
| 0.9333333333333332 | 0 |
| 0.9340277777777778 | 0 |
| 0.9347222222222222 | 0 |
| 0.9354166666666667 | 0 |
| 0.936111111111111 | 0 |
| 0.9368055555555556 | 0 |
| 0.9375 | 0 |
| 0.9381944444444444 | 0 |
| 0.938888888888889 | 0 |
| 0.9395833333333333 | 0 |
| 0.9402777777777778 | 0 |
| 0.9409722222222222 | 0 |
| 0.9416666666666668 | 0 |
| 0.9423611111111111 | 0 |
| 0.9430555555555555 | 0 |
| 0.94375 | 0 |
| 0.9444444444444445 | 0 |
| 0.9451388888888889 | 0 |
| 0.9458333333333333 | 0 |
| 0.9465277777777777 | 0 |
| 0.9472222222222223 | 0 |
| 0.9479166666666666 | 0 |
| 0.9486111111111111 | 0 |
| 0.9493055555555556 | 0 |
| 0.9500000000000001 | 0 |
| 0.9506944444444444 | 0 |
| 0.9513888888888888 | 0 |
| 0.9520833333333334 | 0 |
| 0.9527777777777778 | 0 |
| 0.9534722222222222 | 0 |
| 0.9541666666666666 | 0 |
| 0.9548611111111112 | 0 |
| 0.9555555555555556 | 0 |
| 0.9562499999999999 | 0 |
| 0.9569444444444444 | 0 |
| 0.9576388888888889 | 0 |
| 0.9583333333333334 | 0 |
| 0.9590277777777777 | 0 |
| 0.9597222222222223 | 0 |
| 0.9604166666666667 | 0 |
| 0.9611111111111111 | 0 |
| 0.9618055555555555 | 0 |
| 0.9625 | 0 |
| 0.9631944444444445 | 0 |
| 0.9638888888888889 | 0 |
| 0.9645833333333332 | 0 |
| 0.9652777777777778 | 0 |
| 0.9659722222222222 | 0 |
| 0.9666666666666667 | 0 |
| 0.967361111111111 | 0 |
| 0.9680555555555556 | 0 |
| 0.96875 | 0 |
| 0.9694444444444444 | 0 |
| 0.970138888888889 | 0 |
| 0.9708333333333333 | 0 |
| 0.9715277777777778 | 0 |
| 0.9722222222222222 | 0 |
| 0.9729166666666668 | 0 |
| 0.9736111111111111 | 0 |
| 0.9743055555555555 | 0 |
| 0.975 | 0 |
| 0.9756944444444445 | 0 |
| 0.9763888888888889 | 0 |
| 0.9770833333333333 | 0 |
| 0.9777777777777777 | 0 |
| 0.9784722222222223 | 0 |
| 0.9791666666666666 | 0 |
| 0.9798611111111111 | 0 |
| 0.9805555555555556 | 0 |
| 0.9812500000000001 | 0 |
| 0.9819444444444444 | 0 |
| 0.9826388888888888 | 0 |
| 0.9833333333333334 | 0 |
| 0.9840277777777778 | 0 |
| 0.9847222222222222 | 0 |
| 0.9854166666666666 | 0 |
| 0.9861111111111112 | 0 |
| 0.9868055555555556 | 0 |
| 0.9874999999999999 | 0 |
| 0.9881944444444444 | 0 |
| 0.9888888888888889 | 0 |
| 0.9895833333333334 | 0 |
| 0.9902777777777777 | 0 |
| 0.9909722222222223 | 0 |
| 0.9916666666666667 | 0 |
| 0.9923611111111111 | 0 |
| 0.9930555555555555 | 0 |
| 0.99375 | 0 |
| 0.9944444444444445 | 0 |
| 0.9951388888888889 | 0 |
| 0.9958333333333332 | 0 |
| 0.9965277777777778 | 0 |
| 0.9972222222222222 | 0 |
| 0.9979166666666667 | 0 |
| 0.998611111111111 | 0 |
| 0.9993055555555556 | 0 |